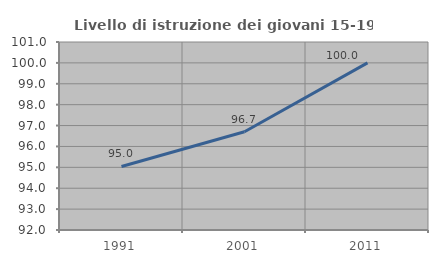
| Category | Livello di istruzione dei giovani 15-19 anni |
|---|---|
| 1991.0 | 95.041 |
| 2001.0 | 96.703 |
| 2011.0 | 100 |